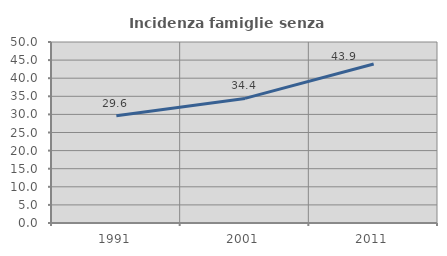
| Category | Incidenza famiglie senza nuclei |
|---|---|
| 1991.0 | 29.636 |
| 2001.0 | 34.416 |
| 2011.0 | 43.931 |